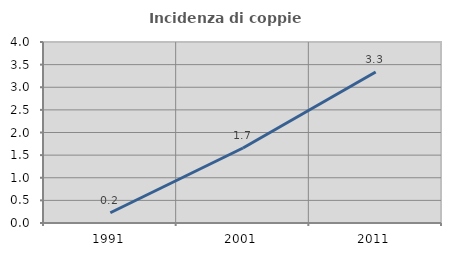
| Category | Incidenza di coppie miste |
|---|---|
| 1991.0 | 0.227 |
| 2001.0 | 1.657 |
| 2011.0 | 3.338 |